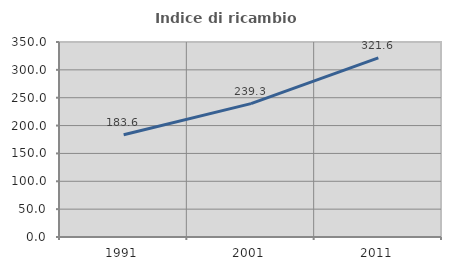
| Category | Indice di ricambio occupazionale  |
|---|---|
| 1991.0 | 183.562 |
| 2001.0 | 239.344 |
| 2011.0 | 321.569 |